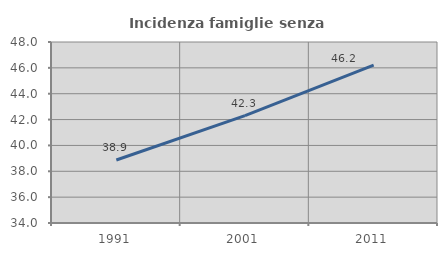
| Category | Incidenza famiglie senza nuclei |
|---|---|
| 1991.0 | 38.871 |
| 2001.0 | 42.301 |
| 2011.0 | 46.208 |